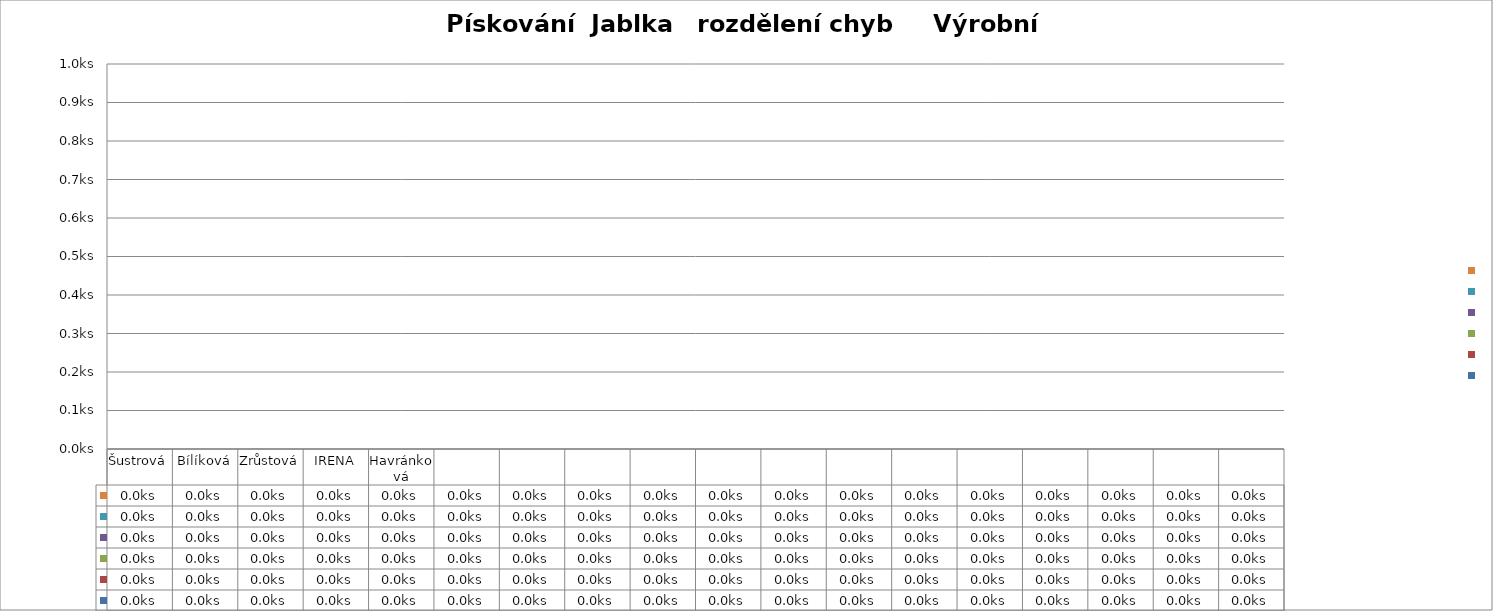
| Category | Series 0 | Series 1 | Series 2 | Series 3 | Series 4 | Series 5 |
|---|---|---|---|---|---|---|
| Šustrová | 0 | 0 | 0 | 0 | 0 | 0 |
| Bílíková | 0 | 0 | 0 | 0 | 0 | 0 |
| Zrůstová | 0 | 0 | 0 | 0 | 0 | 0 |
| IRENA | 0 | 0 | 0 | 0 | 0 | 0 |
| Havránková | 0 | 0 | 0 | 0 | 0 | 0 |